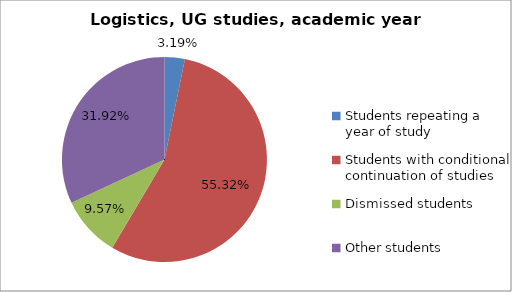
| Category | Series 0 |
|---|---|
| Students repeating a year of study | 3 |
| Students with conditional continuation of studies | 52 |
| Dismissed students | 9 |
| Other students | 30 |